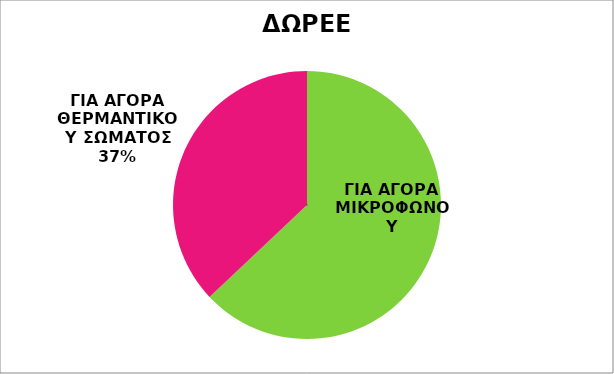
| Category | ΠΟΣΟ |
|---|---|
| ΓΙΑ ΑΓΟΡΑ ΜΙΚΡΟΦΩΝΟΥ | 170 |
| ΓΙΑ ΑΓΟΡΑ ΘΕΡΜΑΝΤΙΚΟΥ ΣΩΜΑΤΟΣ | 100 |